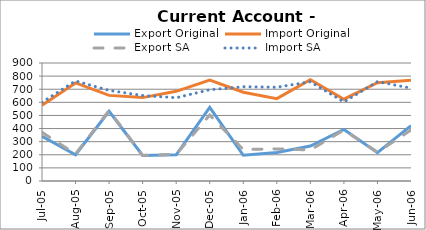
| Category | Export Original | Import Original | Export SA | Import SA |
|---|---|---|---|---|
| 2005-07-31 | 341 | 578 | 371 | 600 |
| 2005-08-31 | 200 | 748 | 206 | 763 |
| 2005-09-30 | 532 | 653 | 538 | 691 |
| 2005-10-31 | 195 | 636 | 195 | 652 |
| 2005-11-30 | 200 | 684 | 203 | 635 |
| 2005-12-31 | 561 | 770 | 503 | 696 |
| 2006-01-31 | 196 | 677 | 240 | 719 |
| 2006-02-28 | 217 | 628 | 245 | 715 |
| 2006-03-31 | 267 | 773 | 237 | 757 |
| 2006-04-30 | 393 | 624 | 389 | 603 |
| 2006-05-31 | 216 | 750 | 220 | 758 |
| 2006-06-30 | 422 | 769 | 389 | 708 |